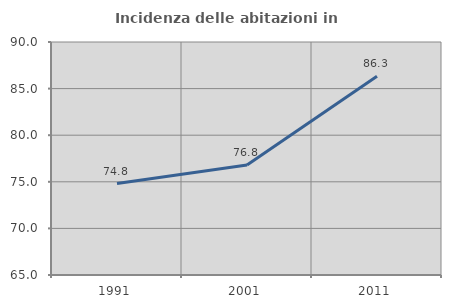
| Category | Incidenza delle abitazioni in proprietà  |
|---|---|
| 1991.0 | 74.809 |
| 2001.0 | 76.807 |
| 2011.0 | 86.322 |